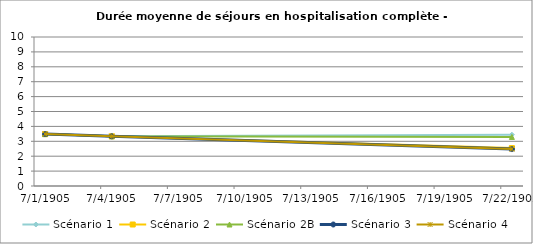
| Category | Scénario 1 | Scénario 2 | Scénario 2B | Scénario 3 | Scénario 4 |
|---|---|---|---|---|---|
| 2009.0 | 3.483 | 3.483 | 3.483 | 3.483 | 3.483 |
| 2012.0 | 3.336 | 3.336 | 3.336 | 3.336 | 3.336 |
| 2030.0 | 3.443 | 2.546 | 3.293 | 2.476 | 2.477 |